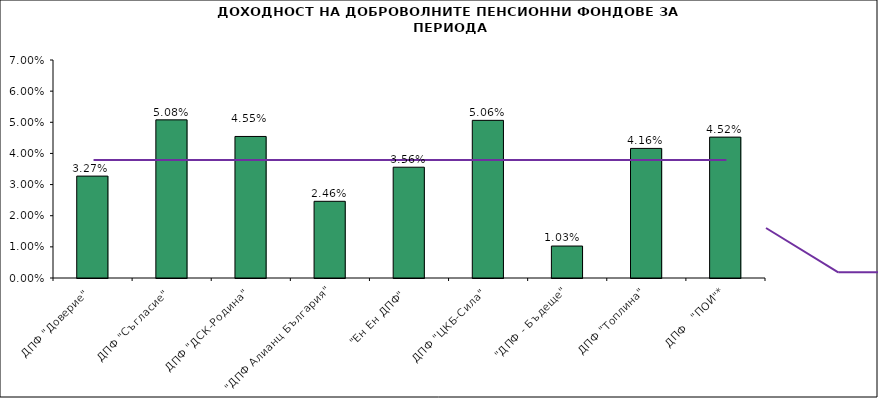
| Category | Series 0 |
|---|---|
| ДПФ "Доверие"  | 0.033 |
| ДПФ "Съгласие"  | 0.051 |
| ДПФ "ДСК-Родина"  | 0.045 |
| "ДПФ Алианц България"  | 0.025 |
| "Ен Ен ДПФ"  | 0.036 |
| ДПФ "ЦКБ-Сила"  | 0.051 |
| "ДПФ - Бъдеще" | 0.01 |
| ДПФ "Топлина" | 0.042 |
| ДПФ   "ПОИ"* | 0.045 |